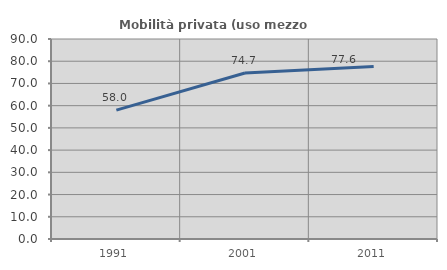
| Category | Mobilità privata (uso mezzo privato) |
|---|---|
| 1991.0 | 58.018 |
| 2001.0 | 74.696 |
| 2011.0 | 77.642 |